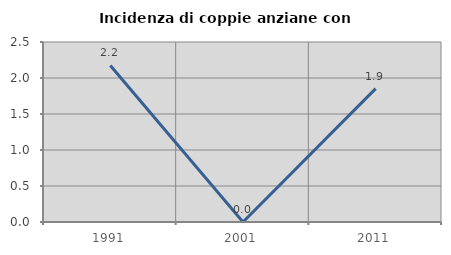
| Category | Incidenza di coppie anziane con figli |
|---|---|
| 1991.0 | 2.174 |
| 2001.0 | 0 |
| 2011.0 | 1.852 |